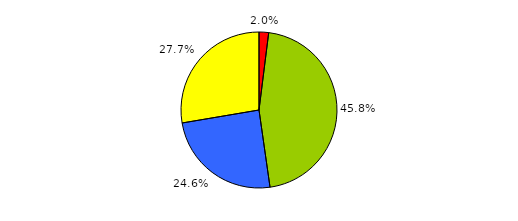
| Category | Series 0 |
|---|---|
| 0 | 11 |
| 1 | 253 |
| 2 | 136 |
| 3 | 153 |